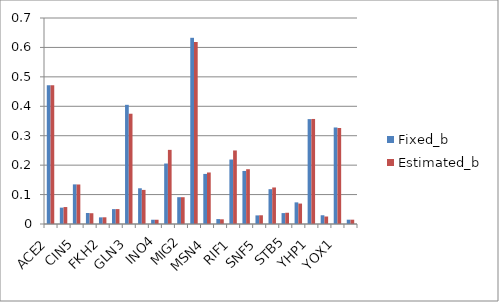
| Category | Fixed_b | Estimated_b |
|---|---|---|
| ACE2 | 0.472 | 0.472 |
| ASG1 | 0.056 | 0.058 |
| CIN5 | 0.135 | 0.134 |
| CYC8 | 0.037 | 0.037 |
| FKH2 | 0.023 | 0.023 |
| GCR2 | 0.051 | 0.051 |
| GLN3 | 0.405 | 0.375 |
| HMO1 | 0.121 | 0.116 |
| INO4 | 0.014 | 0.014 |
| MCM1 | 0.206 | 0.252 |
| MIG2 | 0.091 | 0.091 |
| MSN2 | 0.633 | 0.619 |
| MSN4 | 0.17 | 0.175 |
| PDR1 | 0.017 | 0.016 |
| RIF1 | 0.219 | 0.25 |
| SFP1 | 0.18 | 0.186 |
| SNF5 | 0.029 | 0.03 |
| SNF6 | 0.118 | 0.124 |
| STB5 | 0.037 | 0.038 |
| SWI5 | 0.074 | 0.069 |
| YHP1 | 0.356 | 0.357 |
| YLR278C | 0.03 | 0.025 |
| YOX1 | 0.328 | 0.326 |
| ZAP1 | 0.015 | 0.015 |